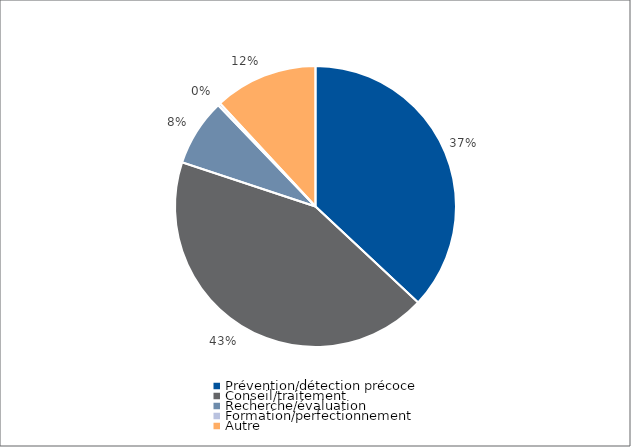
| Category | Series 0 |
|---|---|
| Prévention/détection précoce | 67593 |
| Conseil/traitement | 78846 |
| Recherche/évaluation | 14147 |
| Formation/perfectionnement | 547 |
| Autre | 21726 |